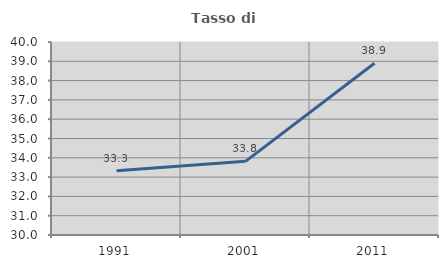
| Category | Tasso di occupazione   |
|---|---|
| 1991.0 | 33.333 |
| 2001.0 | 33.815 |
| 2011.0 | 38.9 |